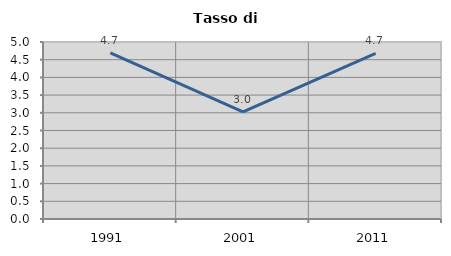
| Category | Tasso di disoccupazione   |
|---|---|
| 1991.0 | 4.694 |
| 2001.0 | 3.028 |
| 2011.0 | 4.676 |